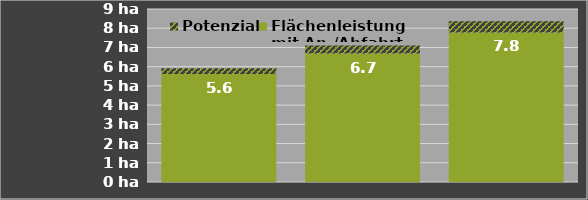
| Category | Flächenleistung 
mit An-/Abfahrt | Potenzial |
|---|---|---|
| 0 | 5.625 | 0.296 |
| 1 | 6.683 | 0.422 |
| 2 | 7.781 | 0.578 |